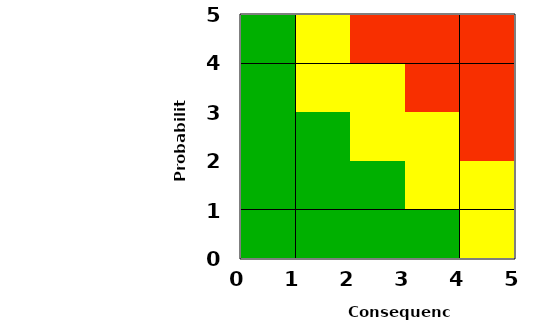
| Category | Series 0 |
|---|---|
| 2.7142857142857144 | 0 |